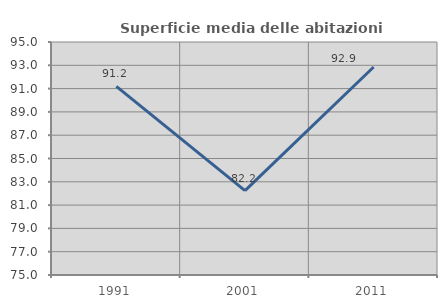
| Category | Superficie media delle abitazioni occupate |
|---|---|
| 1991.0 | 91.195 |
| 2001.0 | 82.243 |
| 2011.0 | 92.856 |